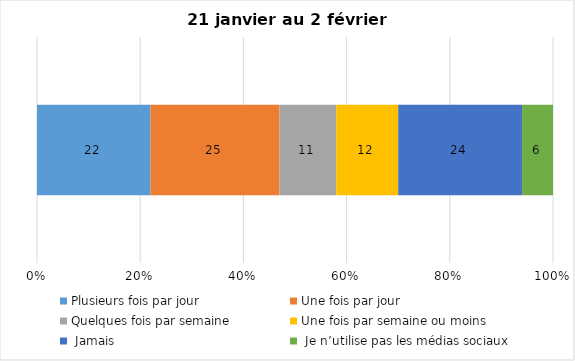
| Category | Plusieurs fois par jour | Une fois par jour | Quelques fois par semaine   | Une fois par semaine ou moins   |  Jamais   |  Je n’utilise pas les médias sociaux |
|---|---|---|---|---|---|---|
| 0 | 22 | 25 | 11 | 12 | 24 | 6 |